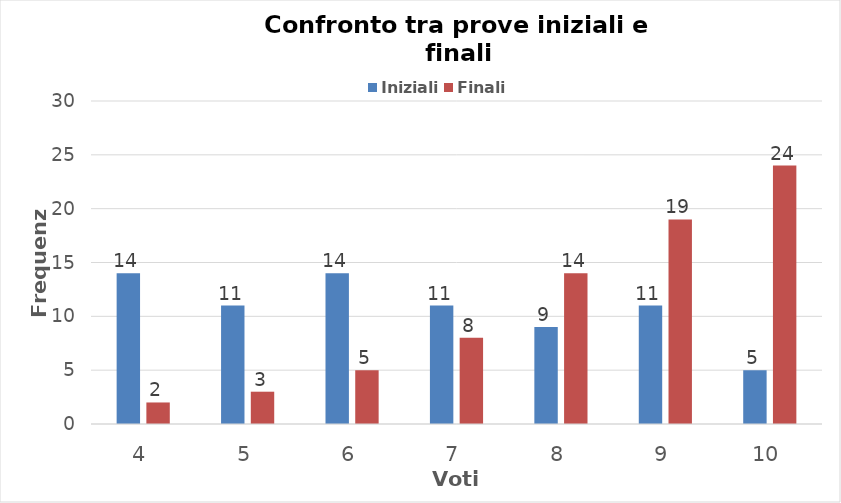
| Category | Iniziali | Finali |
|---|---|---|
| 4.0 | 14 | 2 |
| 5.0 | 11 | 3 |
| 6.0 | 14 | 5 |
| 7.0 | 11 | 8 |
| 8.0 | 9 | 14 |
| 9.0 | 11 | 19 |
| 10.0 | 5 | 24 |